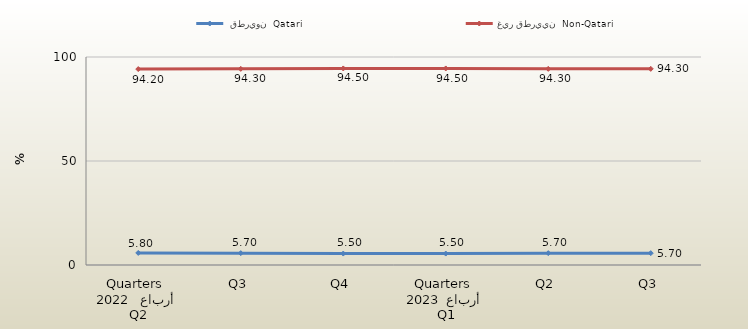
| Category |  قطريون  Qatari | غير قطريين  Non-Qatari |
|---|---|---|
| 0 | 5.8 | 94.2 |
| 1 | 5.7 | 94.3 |
| 2 | 5.5 | 94.5 |
| 3 | 5.5 | 94.5 |
| 4 | 5.7 | 94.3 |
| 5 | 5.7 | 94.3 |